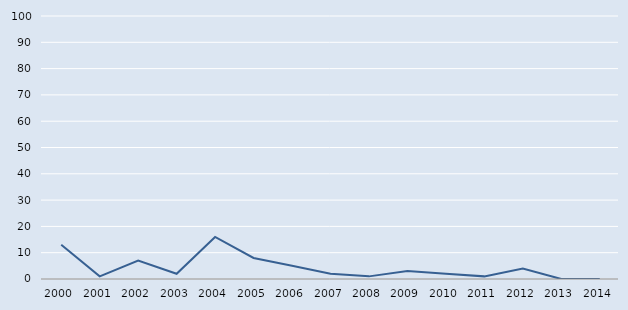
| Category | Series 0 |
|---|---|
| 2000.0 | 13 |
| 2001.0 | 1 |
| 2002.0 | 7 |
| 2003.0 | 2 |
| 2004.0 | 16 |
| 2005.0 | 8 |
| 2006.0 | 5 |
| 2007.0 | 2 |
| 2008.0 | 1 |
| 2009.0 | 3 |
| 2010.0 | 2 |
| 2011.0 | 1 |
| 2012.0 | 4 |
| 2013.0 | 0 |
| 2014.0 | 0 |